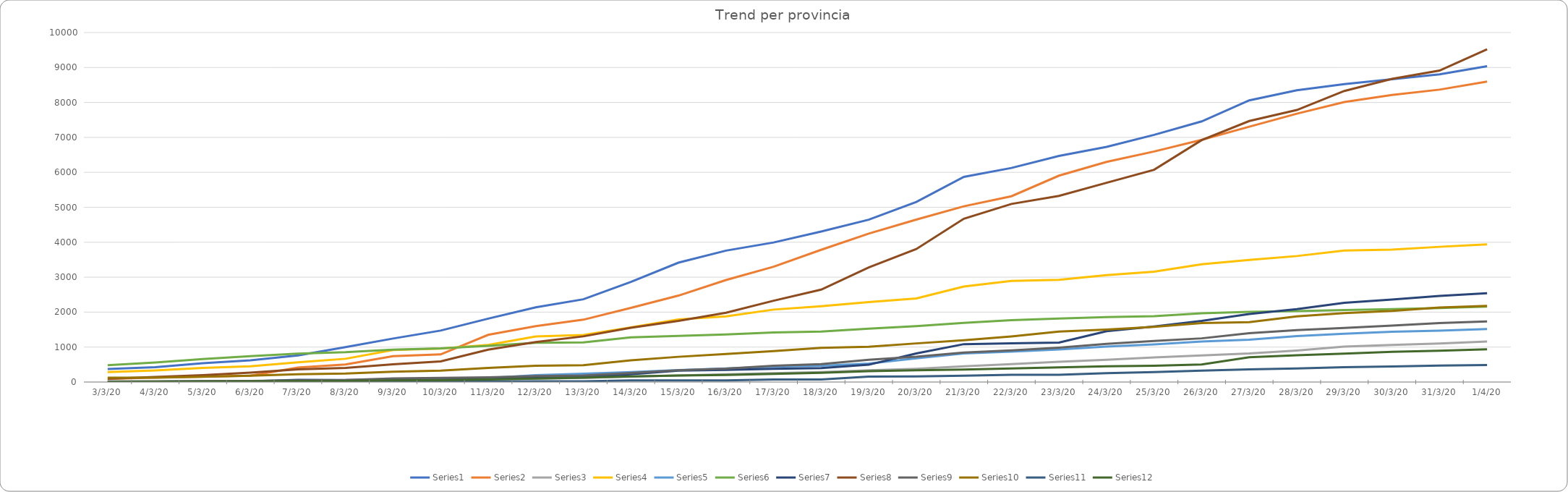
| Category | Series 0 | Series 1 | Series 2 | Series 3 | Series 4 | Series 5 | Series 6 | Series 7 | Series 8 | Series 9 | Series 10 | Series 11 |
|---|---|---|---|---|---|---|---|---|---|---|---|---|
| 2020-03-03 | 372 | 86 | 4 | 287 | 4 | 482 | 9 | 93 | 15 | 122 | 3 | 7 |
| 2020-03-04 | 423 | 127 | 5 | 333 | 5 | 559 | 11 | 145 | 22 | 126 | 4 | 11 |
| 2020-03-05 | 537 | 155 | 11 | 406 | 8 | 658 | 19 | 197 | 26 | 151 | 4 | 17 |
| 2020-03-06 | 623 | 182 | 11 | 452 | 11 | 739 | 20 | 267 | 32 | 180 | 4 | 23 |
| 2020-03-07 | 761 | 413 | 23 | 562 | 35 | 811 | 61 | 361 | 46 | 221 | 6 | 27 |
| 2020-03-08 | 997 | 501 | 27 | 665 | 53 | 853 | 59 | 406 | 56 | 243 | 6 | 32 |
| 2020-03-09 | 1245 | 739 | 40 | 916 | 66 | 928 | 64 | 506 | 102 | 296 | 7 | 44 |
| 2020-03-10 | 1472 | 790 | 46 | 957 | 89 | 963 | 65 | 592 | 119 | 324 | 7 | 50 |
| 2020-03-11 | 1815 | 1351 | 77 | 1061 | 113 | 1035 | 85 | 925 | 137 | 403 | 13 | 75 |
| 2020-03-12 | 2136 | 1598 | 98 | 1302 | 199 | 1123 | 130 | 1146 | 169 | 468 | 23 | 98 |
| 2020-03-13 | 2368 | 1784 | 118 | 1344 | 237 | 1133 | 143 | 1307 | 187 | 482 | 23 | 125 |
| 2020-03-14 | 2864 | 2122 | 154 | 1565 | 287 | 1276 | 224 | 1551 | 261 | 622 | 45 | 158 |
| 2020-03-15 | 3416 | 2473 | 184 | 1792 | 344 | 1320 | 327 | 1750 | 339 | 722 | 45 | 184 |
| 2020-03-16 | 3760 | 2918 | 220 | 1881 | 386 | 1363 | 346 | 1983 | 382 | 801 | 45 | 202 |
| 2020-03-17 | 3993 | 3300 | 256 | 2073 | 440 | 1418 | 376 | 2326 | 465 | 884 | 74 | 234 |
| 2020-03-18 | 4305 | 3784 | 286 | 2167 | 466 | 1445 | 401 | 2644 | 514 | 978 | 75 | 265 |
| 2020-03-19 | 4645 | 4247 | 338 | 2286 | 530 | 1528 | 495 | 3278 | 636 | 1011 | 155 | 310 |
| 2020-03-20 | 5154 | 4648 | 380 | 2392 | 676 | 1597 | 816 | 3804 | 723 | 1105 | 163 | 338 |
| 2020-03-21 | 5869 | 5028 | 452 | 2733 | 818 | 1693 | 1084 | 4672 | 842 | 1194 | 179 | 359 |
| 2020-03-22 | 6126 | 5317 | 512 | 2895 | 872 | 1772 | 1108 | 5096 | 905 | 1306 | 205 | 386 |
| 2020-03-23 | 6471 | 5905 | 581 | 2925 | 934 | 1817 | 1130 | 5326 | 985 | 1444 | 208 | 421 |
| 2020-03-24 | 6728 | 6298 | 635 | 3061 | 1015 | 1860 | 1454 | 5701 | 1093 | 1499 | 253 | 450 |
| 2020-03-25 | 7072 | 6597 | 706 | 3156 | 1076 | 1884 | 1587 | 6074 | 1176 | 1578 | 284 | 468 |
| 2020-03-26 | 7458 | 6931 | 762 | 3370 | 1159 | 1968 | 1750 | 6922 | 1250 | 1685 | 325 | 502 |
| 2020-03-27 | 8060 | 7305 | 816 | 3496 | 1210 | 2006 | 1948 | 7469 | 1398 | 1712 | 362 | 711 |
| 2020-03-28 | 8349 | 7678 | 903 | 3605 | 1316 | 2029 | 2086 | 7783 | 1484 | 1877 | 388 | 768 |
| 2020-03-29 | 8527 | 8013 | 1014 | 3762 | 1381 | 2058 | 2265 | 8329 | 1550 | 1974 | 422 | 812 |
| 2020-03-30 | 8664 | 8213 | 1062 | 3788 | 1437 | 2087 | 2362 | 8676 | 1617 | 2036 | 446 | 866 |
| 2020-03-31 | 8803 | 8367 | 1101 | 3869 | 1470 | 2116 | 2462 | 8911 | 1688 | 2133 | 470 | 893 |
| 2020-04-01 | 9039 | 8598 | 1157 | 3941 | 1516 | 2157 | 2543 | 9522 | 1736 | 2180 | 484 | 937 |